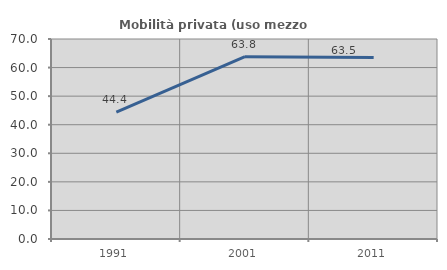
| Category | Mobilità privata (uso mezzo privato) |
|---|---|
| 1991.0 | 44.444 |
| 2001.0 | 63.806 |
| 2011.0 | 63.529 |